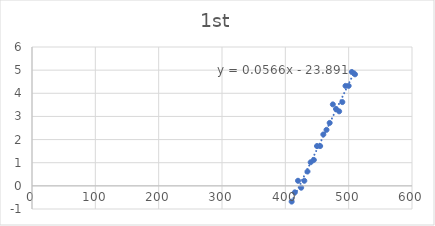
| Category | Series 0 |
|---|---|
| 410.0 | -0.68 |
| 415.0 | -0.28 |
| 420.0 | 0.22 |
| 425.0 | -0.08 |
| 430.0 | 0.22 |
| 435.0 | 0.62 |
| 440.0 | 1.02 |
| 445.0 | 1.12 |
| 450.0 | 1.72 |
| 455.0 | 1.72 |
| 460.0 | 2.22 |
| 465.0 | 2.42 |
| 470.0 | 2.72 |
| 475.0 | 3.52 |
| 480.0 | 3.32 |
| 485.0 | 3.22 |
| 490.0 | 3.62 |
| 495.0 | 4.32 |
| 500.0 | 4.32 |
| 505.0 | 4.92 |
| 510.0 | 4.82 |